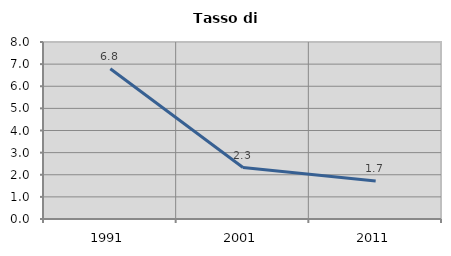
| Category | Tasso di disoccupazione   |
|---|---|
| 1991.0 | 6.794 |
| 2001.0 | 2.327 |
| 2011.0 | 1.719 |